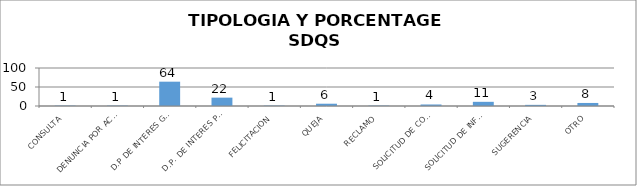
| Category | Series 0 |
|---|---|
| CONSULTA | 1 |
| DENUNCIA POR ACTOS DE CORRUPCION | 1 |
| D.P DE INTERES GENERAL | 64 |
| D.P. DE INTERES PARTICULAR | 22 |
| FELICITACION | 1 |
| QUEJA | 6 |
| RECLAMO | 1 |
| SOLICITUD DE COPIA | 4 |
| SOLICITUD DE INFORMACION | 11 |
| SUGERENCIA | 3 |
| OTRO | 8 |